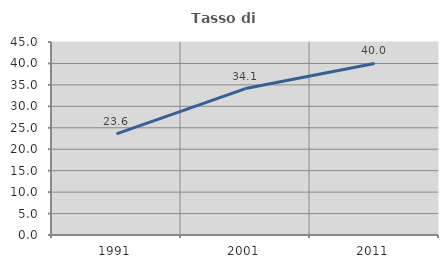
| Category | Tasso di occupazione   |
|---|---|
| 1991.0 | 23.585 |
| 2001.0 | 34.146 |
| 2011.0 | 40 |